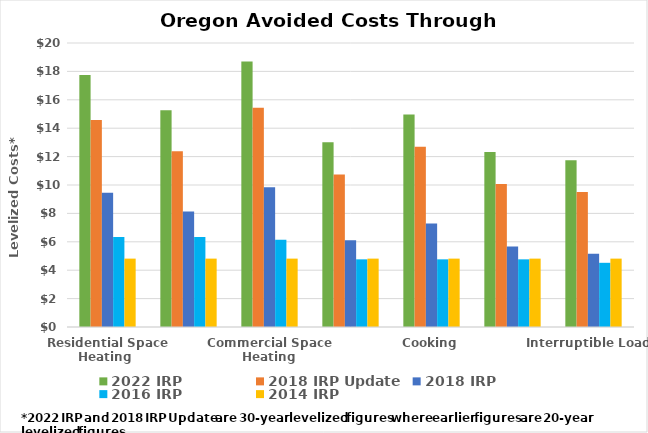
| Category | 2022 IRP | 2018 IRP Update | 2018 IRP | 2016 IRP | 2014 IRP |
|---|---|---|---|---|---|
| Residential Space Heating  | 17.748 | 14.575 | 9.451 | 6.345 | 4.816 |
| Residential Hearths and Fireplaces | 15.268 | 12.374 | 8.137 | 6.345 | 4.816 |
| Commercial Space Heating | 18.7 | 15.443 | 9.839 | 6.152 | 4.816 |
| Water Heating | 13.017 | 10.743 | 6.111 | 4.764 | 4.816 |
| Cooking | 14.957 | 12.688 | 7.282 | 4.764 | 4.816 |
| Process Load | 12.329 | 10.07 | 5.662 | 4.764 | 4.816 |
| Interruptible Loads | 11.735 | 9.51 | 5.161 | 4.521 | 4.816 |